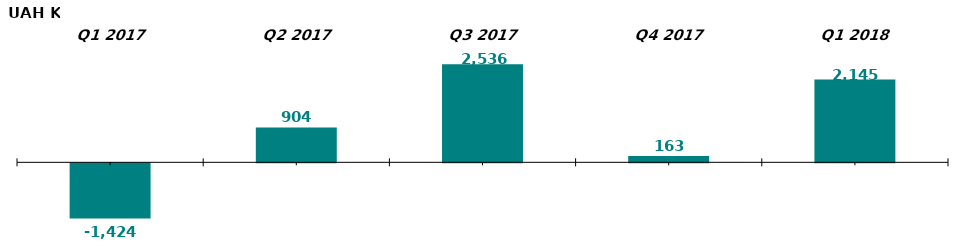
| Category | Net Inflow / Outflow in Open-Ended CII in Q1 2017-2018, UAH K |
|---|---|
| Q1 2017 | -1423.808 |
| Q2 2017 | 903.571 |
| Q3 2017 | 2536.489 |
| Q4 2017 | 162.522 |
| Q1 2018 | 2145.214 |